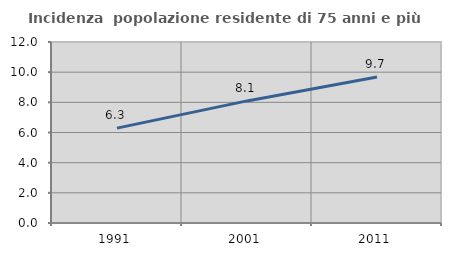
| Category | Incidenza  popolazione residente di 75 anni e più |
|---|---|
| 1991.0 | 6.292 |
| 2001.0 | 8.095 |
| 2011.0 | 9.677 |